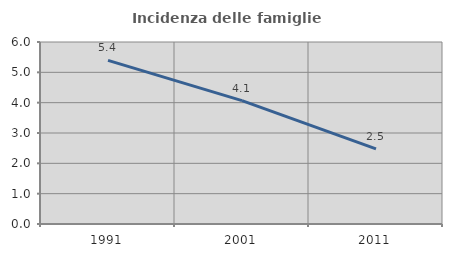
| Category | Incidenza delle famiglie numerose |
|---|---|
| 1991.0 | 5.396 |
| 2001.0 | 4.068 |
| 2011.0 | 2.477 |